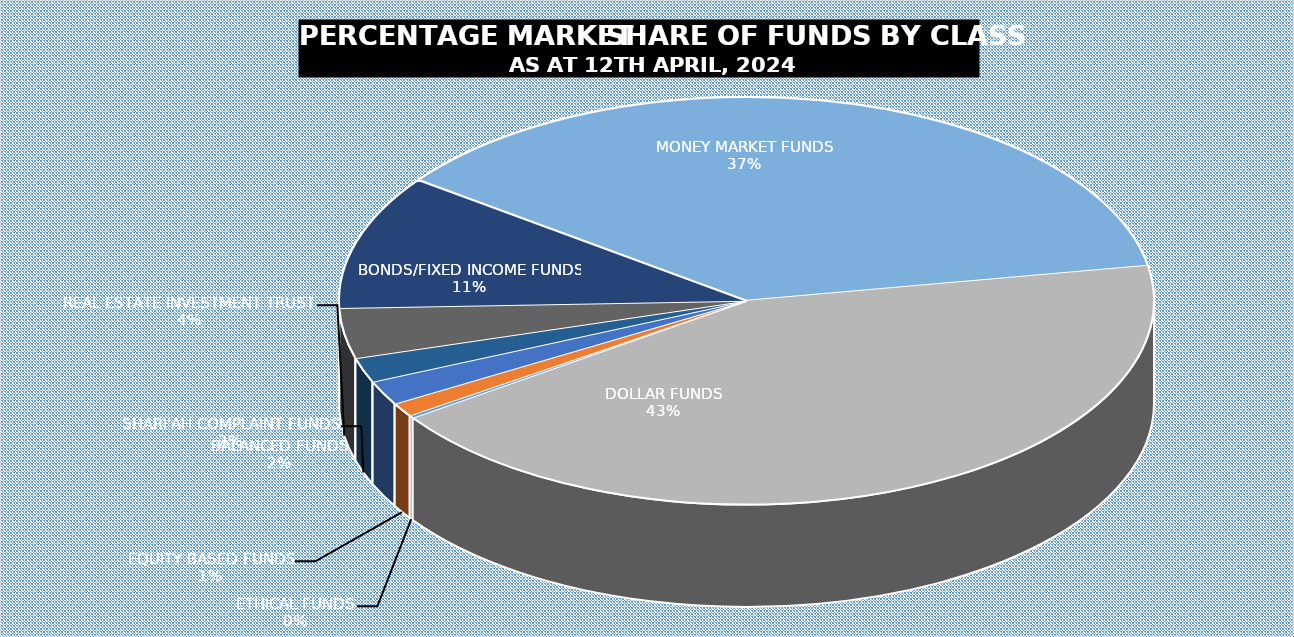
| Category | 12-Apr |
|---|---|
| ETHICAL FUNDS | 5005243623.09 |
| EQUITY BASED FUNDS | 27759764748.77 |
| BALANCED FUNDS | 48079052440.593 |
| SHARI'AH COMPLAINT FUNDS | 49509658646.534 |
| REAL ESTATE INVESTMENT TRUST | 99870092317.262 |
| BONDS/FIXED INCOME FUNDS | 268371629137.21 |
| MONEY MARKET FUNDS | 934334906874.484 |
| DOLLAR FUNDS | 1082391359671.313 |